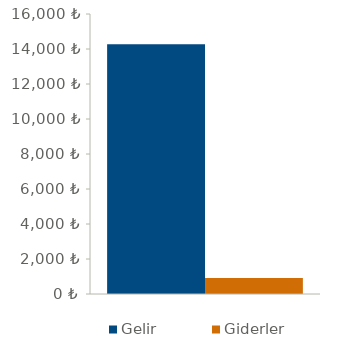
| Category | Gelir | Giderler |
|---|---|---|
| 0 | 14275 | 915 |